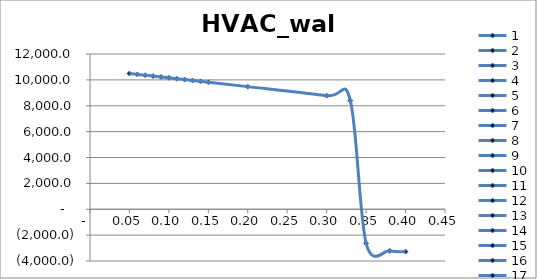
| Category | HVAC_wall |
|---|---|
| 0.05 | 10489.145 |
| 0.06 | 10423.132 |
| 0.07 | 10356.934 |
| 0.08 | 10290.545 |
| 0.09 | 10223.958 |
| 0.1 | 10157.173 |
| 0.11 | 10090.184 |
| 0.12 | 10022.99 |
| 0.13 | 9955.59 |
| 0.14 | 9887.982 |
| 0.15 | 9820.165 |
| 0.2 | 9477.944 |
| 0.3 | 8779.511 |
| 0.33 | 8393.483 |
| 0.35 | -2633.493 |
| 0.38 | -3215.645 |
| 0.4 | -3273.394 |